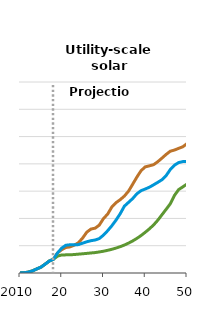
| Category | No PTC/ITC Sunset case | Early PTC/ITC Sunset case | Reference case |
|---|---|---|---|
| 2010.0 | 0.376 | 0.376 | 0.376 |
| 2011.0 | 0.918 | 0.918 | 0.918 |
| 2012.0 | 3.287 | 3.287 | 3.287 |
| 2013.0 | 7.803 | 7.803 | 7.803 |
| 2014.0 | 14.862 | 14.862 | 14.862 |
| 2015.0 | 21.228 | 21.228 | 21.228 |
| 2016.0 | 32.202 | 32.202 | 32.202 |
| 2017.0 | 43.636 | 43.636 | 43.636 |
| 2018.0 | 50.425 | 50.425 | 50.425 |
| 2019.0 | 73.755 | 61.869 | 73.787 |
| 20.0 | 85.562 | 66.15 | 91.324 |
| 2021.0 | 93.434 | 66.462 | 101.869 |
| 2022.0 | 95.867 | 66.571 | 103.418 |
| 2023.0 | 101.98 | 67.749 | 103.513 |
| 2024.0 | 110.991 | 69.105 | 104.025 |
| 2025.0 | 128.103 | 70.425 | 109.362 |
| 2026.0 | 149.705 | 71.897 | 114.579 |
| 2027.0 | 161.028 | 73.423 | 118.37 |
| 2028.0 | 164.273 | 74.871 | 120.894 |
| 2029.0 | 175.745 | 77.174 | 126.251 |
| 30.0 | 199.621 | 79.81 | 138.945 |
| 2031.0 | 215.938 | 83.13 | 155.065 |
| 2032.0 | 241.989 | 86.934 | 173.151 |
| 2033.0 | 257.827 | 91.338 | 193.858 |
| 2034.0 | 268.657 | 96.451 | 217.175 |
| 2035.0 | 281.934 | 102.469 | 244.92 |
| 2036.0 | 299.97 | 109.502 | 258.92 |
| 2037.0 | 325.646 | 117.557 | 273 |
| 2038.0 | 351.628 | 126.893 | 290.505 |
| 2039.0 | 375.033 | 137.322 | 301.721 |
| 40.0 | 388.992 | 149.255 | 307.814 |
| 2041.0 | 392.778 | 161.892 | 314.491 |
| 2042.0 | 396.98 | 176.158 | 323.122 |
| 2043.0 | 407.853 | 193.337 | 332.247 |
| 2044.0 | 420.937 | 213.404 | 341.795 |
| 2045.0 | 434.652 | 233.444 | 356.9 |
| 2046.0 | 446.275 | 253.784 | 379.23 |
| 2047.0 | 450.661 | 284.468 | 395.255 |
| 2048.0 | 456.753 | 305.599 | 404.646 |
| 2049.0 | 462.621 | 315.611 | 408.278 |
| 50.0 | 474.088 | 326.122 | 408.99 |